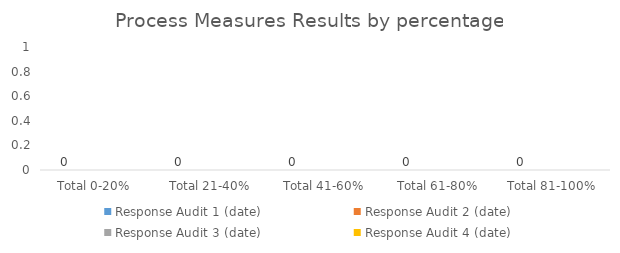
| Category | Response Audit 1 (date) | Response Audit 2 (date) | Response Audit 3 (date) | Response Audit 4 (date) |
|---|---|---|---|---|
| Total 0-20%  | 0 | 0 | 0 | 0 |
| Total 21-40% | 0 | 0 | 0 | 0 |
| Total 41-60% | 0 | 0 | 0 | 0 |
| Total 61-80% | 0 | 0 | 0 | 0 |
| Total 81-100% | 0 | 0 | 0 | 0 |